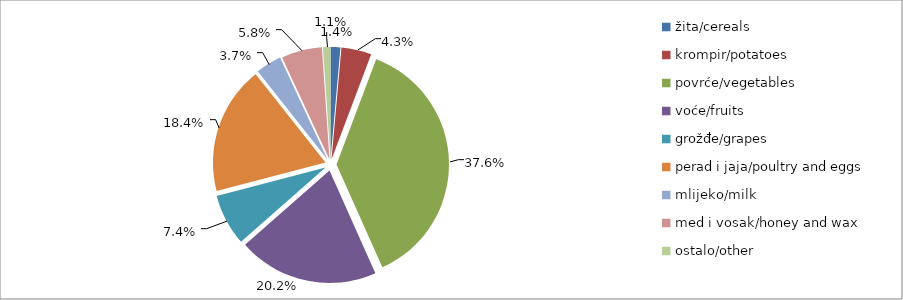
| Category | Series 0 |
|---|---|
| žita/cereals | 21397 |
| krompir/potatoes | 65353 |
| povrće/vegetables | 568372 |
| voće/fruits | 305581 |
| grožđe/grapes | 111759.5 |
| perad i jaja/poultry and eggs | 278739 |
| mlijeko/milk | 56488 |
| med i vosak/honey and wax | 88453 |
| ostalo/other | 16300 |